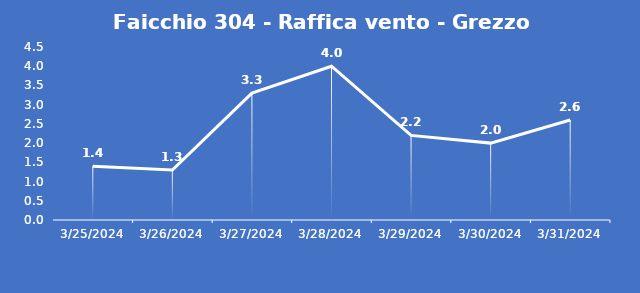
| Category | Faicchio 304 - Raffica vento - Grezzo (m/s) |
|---|---|
| 3/25/24 | 1.4 |
| 3/26/24 | 1.3 |
| 3/27/24 | 3.3 |
| 3/28/24 | 4 |
| 3/29/24 | 2.2 |
| 3/30/24 | 2 |
| 3/31/24 | 2.6 |